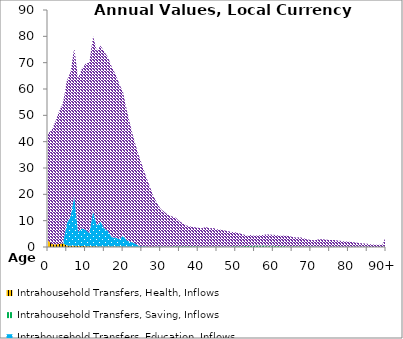
| Category | Intrahousehold Transfers, Health, Inflows | Intrahousehold Transfers, Saving, Inflows | Intrahousehold Transfers, Education, Inflows | Intrahousehold Transfers, Consumption other than health and education, Inflows |
|---|---|---|---|---|
| 0 | 2478.022 | 0 | 0 | 40565.842 |
|  | 1105.092 | 0 | 0 | 43368.925 |
| 2 | 1032.076 | 0 | 0 | 46713.597 |
| 3 | 1128.041 | 0 | 0 | 50592.422 |
| 4 | 1426.556 | 0 | 0 | 53197.599 |
| 5 | 541.691 | 0 | 8495.102 | 54009.382 |
| 6 | 492.659 | 0 | 11194.14 | 54769.296 |
| 7 | 450.401 | 0 | 18968.707 | 56322.61 |
| 8 | 408.446 | 0 | 5318.836 | 58325.437 |
| 9 | 365.645 | 0 | 6744.407 | 60533.173 |
| 10 | 323.217 | 0 | 6227.935 | 63023.184 |
| 11 | 288.743 | 0 | 4986.221 | 64847.67 |
| 12 | 264.131 | 0 | 13428.846 | 66356.157 |
| 13 | 229.825 | 0 | 7943.437 | 66321.533 |
| 14 | 209.442 | 0 | 9426.996 | 66830.697 |
| 15 | 188.071 | 0 | 6892.431 | 67057.98 |
| 16 | 180.712 | 0 | 5901.581 | 65838.894 |
| 17 | 174.561 | 0 | 3502.418 | 64642.893 |
| 18 | 165.372 | 0 | 3440.651 | 61931.997 |
| 19 | 157.897 | 0 | 2820.339 | 58902.646 |
| 20 | 144.317 | 0 | 4262.474 | 54254.388 |
| 21 | 134.231 | 0 | 2302.558 | 49349.341 |
| 22 | 119.155 | 0 | 1827.536 | 43905.131 |
| 23 | 103.136 | 0 | 1375.991 | 38768.978 |
| 24 | 91.668 | 0 | 505.287 | 34953.44 |
| 25 | 90.873 | 0 | 154.517 | 31057.415 |
| 26 | 82.127 | 0 | 184.693 | 26880.331 |
| 27 | 67.241 | 0 | 11.109 | 23325.035 |
| 28 | 53.489 | 35.51 | 0 | 19459 |
| 29 | 44.86 | 74.161 | 35.529 | 16621.095 |
| 30 | 35.319 | 111.619 | 35.864 | 14297.43 |
| 31 | 30.928 | 147.651 | 14.653 | 13103.482 |
| 32 | 24.806 | 181.753 | 0 | 11985.695 |
| 33 | 22.908 | 207.847 | 0 | 11381.302 |
| 34 | 22.158 | 227.667 | 0 | 10885.662 |
| 35 | 16.223 | 243.085 | 0 | 9529.352 |
| 36 | 4.686 | 252.713 | 0 | 8666.311 |
| 37 | 0 | 261.179 | 0 | 7831.042 |
| 38 | 4.193 | 259.238 | 0 | 7509.456 |
| 39 | 4.113 | 251.478 | 0 | 7265.566 |
| 40 | 4.024 | 237.853 | 0 | 7040.422 |
| 41 | 3.926 | 221.167 | 0 | 6905.496 |
| 42 | 14.52 | 203.083 | 0 | 7343.098 |
| 43 | 14.151 | 190.717 | 0 | 6911.372 |
| 44 | 18.397 | 184.879 | 0 | 6992.66 |
| 45 | 17.789 | 179.561 | 0 | 6536.65 |
| 46 | 17.095 | 186.84 | 0 | 6311.051 |
| 47 | 18.387 | 191.234 | 0 | 6089.493 |
| 48 | 17.484 | 206.631 | 0 | 5776.731 |
| 49 | 13.942 | 222.04 | 0 | 5448.699 |
| 50 | 13.169 | 246.618 | 0 | 5291.636 |
| 51 | 12.41 | 263.963 | 0 | 4904.913 |
| 52 | 11.7 | 309.5 | 0 | 4472.286 |
| 53 | 4.667 | 370.249 | 0 | 3900.792 |
| 54 | 13.12 | 449.74 | 0 | 4089.407 |
| 55 | 16.415 | 499.76 | 0 | 3792.787 |
| 56 | 19.631 | 529.411 | 0 | 3827.231 |
| 57 | 27.103 | 511.999 | 0 | 3984.143 |
| 58 | 58.045 | 469.822 | 0 | 4220.429 |
| 59 | 63.881 | 413.175 | 0 | 4242.578 |
| 60 | 63.178 | 368.313 | 0 | 4206.895 |
| 61 | 62.873 | 331.596 | 0 | 4097.888 |
| 62 | 60.115 | 307.066 | 0 | 3878.685 |
| 63 | 61.17 | 281.52 | 0 | 4015.647 |
| 64 | 59.629 | 249.217 | 0 | 3942.753 |
| 65 | 54.501 | 222.923 | 0 | 3546.813 |
| 66 | 51.515 | 200.735 | 0 | 3346.597 |
| 67 | 55.396 | 183.225 | 0 | 3436.269 |
| 68 | 56.03 | 168.832 | 0 | 3168.131 |
| 69 | 36.094 | 157.304 | 0 | 2663.276 |
| 70 | 35.964 | 143.952 | 0 | 2535.255 |
| 71 | 36.299 | 130.616 | 0 | 2351.644 |
| 72 | 36.036 | 116.782 | 0 | 2736.239 |
| 73 | 36.543 | 102.831 | 0 | 2850.849 |
| 74 | 37.516 | 88.513 | 0 | 2654.66 |
| 75 | 40.099 | 76.502 | 0 | 2542.161 |
| 76 | 42.788 | 65.662 | 0 | 2574.202 |
| 77 | 39.615 | 55.596 | 0 | 2386.712 |
| 78 | 41.36 | 47.824 | 0 | 2225.5 |
| 79 | 41.277 | 41.66 | 0 | 2067.191 |
| 80 | 46.459 | 34.3 | 0 | 1978.059 |
| 81 | 45.292 | 27.508 | 0 | 1804.576 |
| 82 | 42.66 | 21.714 | 0 | 1621.626 |
| 83 | 43.715 | 16.76 | 0 | 1391.894 |
| 84 | 42.511 | 12.998 | 0 | 1298.914 |
| 85 | 39.187 | 10.305 | 0 | 1185.962 |
| 86 | 33.433 | 8.231 | 0 | 1017.556 |
| 87 | 28.619 | 6.806 | 0 | 828.029 |
| 88 | 25.718 | 5.269 | 0 | 820.396 |
| 89 | 21.402 | 3.802 | 0 | 735.188 |
| 90+ | 68.74 | 7.497 | 0 | 4018.462 |